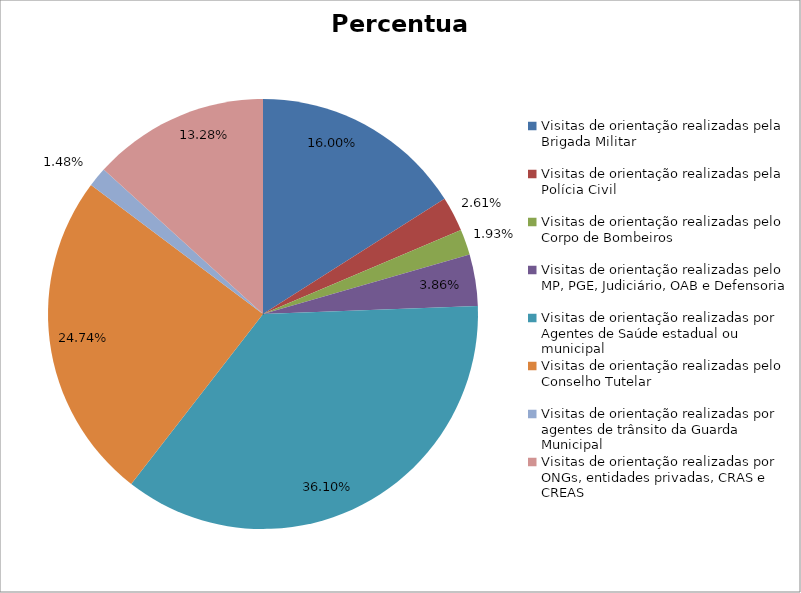
| Category | Percentual |
|---|---|
| Visitas de orientação realizadas pela Brigada Militar | 0.16 |
| Visitas de orientação realizadas pela Polícia Civil | 0.026 |
| Visitas de orientação realizadas pelo Corpo de Bombeiros | 0.019 |
| Visitas de orientação realizadas pelo MP, PGE, Judiciário, OAB e Defensoria | 0.039 |
| Visitas de orientação realizadas por Agentes de Saúde estadual ou municipal | 0.361 |
| Visitas de orientação realizadas pelo Conselho Tutelar | 0.247 |
| Visitas de orientação realizadas por agentes de trânsito da Guarda Municipal | 0.015 |
| Visitas de orientação realizadas por ONGs, entidades privadas, CRAS e CREAS | 0.133 |